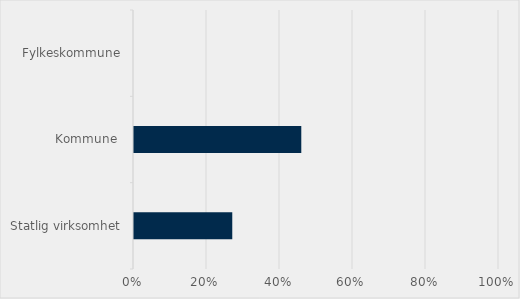
| Category | Prosent |
|---|---|
| Statlig virksomhet | 0.269 |
| Kommune  | 0.458 |
| Fylkeskommune | 0 |